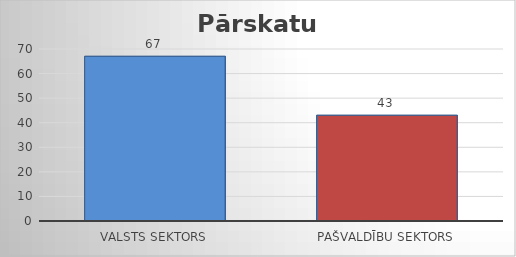
| Category | Series 0 |
|---|---|
| Valsts sektors | 67 |
| Pašvaldību sektors | 43 |